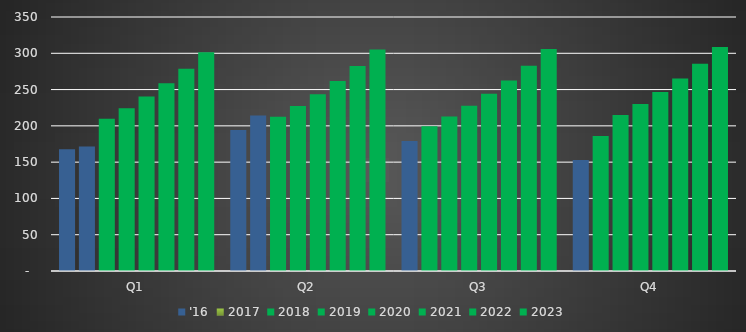
| Category | '15 | '16 | 2017 | 2018 | 2019 | 2020 | 2021 | 2022 | 2023 |
|---|---|---|---|---|---|---|---|---|---|
| Q1 |  | 167.63 | 171.6 | 209.686 | 224.302 | 240.529 | 258.594 | 278.758 | 301.329 |
| Q2 |  | 194.18 | 214.3 | 212.382 | 227.197 | 243.638 | 261.935 | 282.351 | 305.194 |
| Q3 |  | 179.18 | 199.378 | 212.784 | 227.622 | 244.09 | 262.415 | 282.86 | 305.735 |
| Q4 |  | 152.85 | 186.118 | 214.966 | 229.958 | 246.591 | 265.093 | 285.73 | 308.81 |